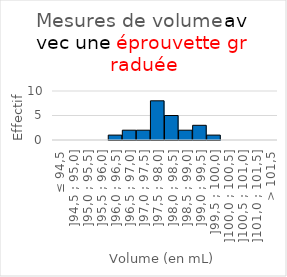
| Category | Series 0 |
|---|---|
| ≤ 94,5 | 0 |
| ]94,5 ; 95,0] | 0 |
| ]95,0 ; 95,5] | 0 |
| ]95,5 ; 96,0] | 0 |
| ]96,0 ; 96,5] | 1 |
| ]96,5 ; 97,0] | 2 |
| ]97,0 ; 97,5] | 2 |
| ]97,5 ; 98,0] | 8 |
| ]98,0 ; 98,5] | 5 |
| ]98,5 ; 99,0] | 2 |
| ]99,0 ; 99,5] | 3 |
| ]99,5 ; 100,0] | 1 |
| ]100,0 ; 100,5] | 0 |
| ]100,5 ; 101,0] | 0 |
| ]101,0 ; 101,5] | 0 |
| > 101,5 | 0 |